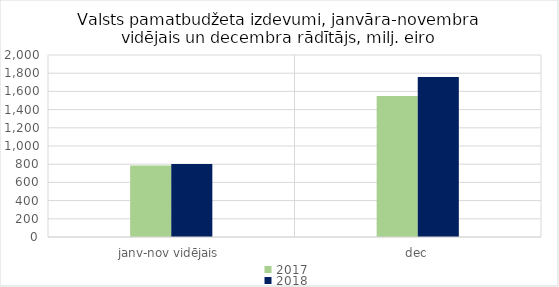
| Category | 2017 | 2018 |
|---|---|---|
| janv-nov vidējais | 784625.88 | 801256.619 |
| dec | 1550280.295 | 1757604.888 |